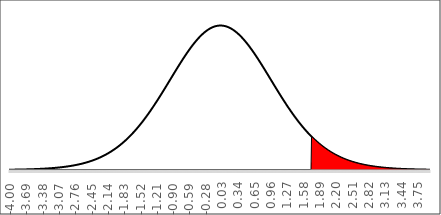
| Category | f(x) | Shaded Area |
|---|---|---|
| -4.0 | 0.001 | 0 |
| -3.99 | 0.001 | 0 |
| -3.9800000000000004 | 0.001 | 0 |
| -3.9700000000000006 | 0.001 | 0 |
| -3.960000000000001 | 0.001 | 0 |
| -3.950000000000001 | 0.001 | 0 |
| -3.9400000000000013 | 0.001 | 0 |
| -3.9300000000000015 | 0.001 | 0 |
| -3.9200000000000017 | 0.001 | 0 |
| -3.910000000000002 | 0.001 | 0 |
| -3.900000000000002 | 0.001 | 0 |
| -3.8900000000000023 | 0.001 | 0 |
| -3.8800000000000026 | 0.001 | 0 |
| -3.8700000000000028 | 0.001 | 0 |
| -3.860000000000003 | 0.001 | 0 |
| -3.850000000000003 | 0.001 | 0 |
| -3.8400000000000034 | 0.001 | 0 |
| -3.8300000000000036 | 0.001 | 0 |
| -3.820000000000004 | 0.001 | 0 |
| -3.810000000000004 | 0.001 | 0 |
| -3.8000000000000043 | 0.001 | 0 |
| -3.7900000000000045 | 0.001 | 0 |
| -3.7800000000000047 | 0.001 | 0 |
| -3.770000000000005 | 0.001 | 0 |
| -3.760000000000005 | 0.001 | 0 |
| -3.7500000000000053 | 0.001 | 0 |
| -3.7400000000000055 | 0.002 | 0 |
| -3.7300000000000058 | 0.002 | 0 |
| -3.720000000000006 | 0.002 | 0 |
| -3.710000000000006 | 0.002 | 0 |
| -3.7000000000000064 | 0.002 | 0 |
| -3.6900000000000066 | 0.002 | 0 |
| -3.680000000000007 | 0.002 | 0 |
| -3.670000000000007 | 0.002 | 0 |
| -3.6600000000000072 | 0.002 | 0 |
| -3.6500000000000075 | 0.002 | 0 |
| -3.6400000000000077 | 0.002 | 0 |
| -3.630000000000008 | 0.002 | 0 |
| -3.620000000000008 | 0.002 | 0 |
| -3.6100000000000083 | 0.002 | 0 |
| -3.6000000000000085 | 0.002 | 0 |
| -3.5900000000000087 | 0.002 | 0 |
| -3.580000000000009 | 0.002 | 0 |
| -3.570000000000009 | 0.002 | 0 |
| -3.5600000000000094 | 0.002 | 0 |
| -3.5500000000000096 | 0.002 | 0 |
| -3.54000000000001 | 0.002 | 0 |
| -3.53000000000001 | 0.002 | 0 |
| -3.5200000000000102 | 0.002 | 0 |
| -3.5100000000000104 | 0.003 | 0 |
| -3.5000000000000107 | 0.003 | 0 |
| -3.490000000000011 | 0.003 | 0 |
| -3.480000000000011 | 0.003 | 0 |
| -3.4700000000000113 | 0.003 | 0 |
| -3.4600000000000115 | 0.003 | 0 |
| -3.4500000000000117 | 0.003 | 0 |
| -3.440000000000012 | 0.003 | 0 |
| -3.430000000000012 | 0.003 | 0 |
| -3.4200000000000124 | 0.003 | 0 |
| -3.4100000000000126 | 0.003 | 0 |
| -3.400000000000013 | 0.003 | 0 |
| -3.390000000000013 | 0.003 | 0 |
| -3.380000000000013 | 0.003 | 0 |
| -3.3700000000000134 | 0.004 | 0 |
| -3.3600000000000136 | 0.004 | 0 |
| -3.350000000000014 | 0.004 | 0 |
| -3.340000000000014 | 0.004 | 0 |
| -3.3300000000000143 | 0.004 | 0 |
| -3.3200000000000145 | 0.004 | 0 |
| -3.3100000000000147 | 0.004 | 0 |
| -3.300000000000015 | 0.004 | 0 |
| -3.290000000000015 | 0.004 | 0 |
| -3.2800000000000153 | 0.004 | 0 |
| -3.2700000000000156 | 0.004 | 0 |
| -3.2600000000000158 | 0.004 | 0 |
| -3.250000000000016 | 0.005 | 0 |
| -3.240000000000016 | 0.005 | 0 |
| -3.2300000000000164 | 0.005 | 0 |
| -3.2200000000000166 | 0.005 | 0 |
| -3.210000000000017 | 0.005 | 0 |
| -3.200000000000017 | 0.005 | 0 |
| -3.1900000000000173 | 0.005 | 0 |
| -3.1800000000000175 | 0.005 | 0 |
| -3.1700000000000177 | 0.005 | 0 |
| -3.160000000000018 | 0.006 | 0 |
| -3.150000000000018 | 0.006 | 0 |
| -3.1400000000000183 | 0.006 | 0 |
| -3.1300000000000185 | 0.006 | 0 |
| -3.1200000000000188 | 0.006 | 0 |
| -3.110000000000019 | 0.006 | 0 |
| -3.100000000000019 | 0.006 | 0 |
| -3.0900000000000194 | 0.007 | 0 |
| -3.0800000000000196 | 0.007 | 0 |
| -3.07000000000002 | 0.007 | 0 |
| -3.06000000000002 | 0.007 | 0 |
| -3.0500000000000203 | 0.007 | 0 |
| -3.0400000000000205 | 0.007 | 0 |
| -3.0300000000000207 | 0.007 | 0 |
| -3.020000000000021 | 0.008 | 0 |
| -3.010000000000021 | 0.008 | 0 |
| -3.0000000000000213 | 0.008 | 0 |
| -2.9900000000000215 | 0.008 | 0 |
| -2.9800000000000217 | 0.008 | 0 |
| -2.970000000000022 | 0.008 | 0 |
| -2.960000000000022 | 0.009 | 0 |
| -2.9500000000000224 | 0.009 | 0 |
| -2.9400000000000226 | 0.009 | 0 |
| -2.930000000000023 | 0.009 | 0 |
| -2.920000000000023 | 0.009 | 0 |
| -2.9100000000000232 | 0.01 | 0 |
| -2.9000000000000234 | 0.01 | 0 |
| -2.8900000000000237 | 0.01 | 0 |
| -2.880000000000024 | 0.01 | 0 |
| -2.870000000000024 | 0.011 | 0 |
| -2.8600000000000243 | 0.011 | 0 |
| -2.8500000000000245 | 0.011 | 0 |
| -2.8400000000000247 | 0.011 | 0 |
| -2.830000000000025 | 0.011 | 0 |
| -2.820000000000025 | 0.012 | 0 |
| -2.8100000000000254 | 0.012 | 0 |
| -2.8000000000000256 | 0.012 | 0 |
| -2.790000000000026 | 0.012 | 0 |
| -2.780000000000026 | 0.013 | 0 |
| -2.770000000000026 | 0.013 | 0 |
| -2.7600000000000264 | 0.013 | 0 |
| -2.7500000000000266 | 0.014 | 0 |
| -2.740000000000027 | 0.014 | 0 |
| -2.730000000000027 | 0.014 | 0 |
| -2.7200000000000273 | 0.014 | 0 |
| -2.7100000000000275 | 0.015 | 0 |
| -2.7000000000000277 | 0.015 | 0 |
| -2.690000000000028 | 0.015 | 0 |
| -2.680000000000028 | 0.016 | 0 |
| -2.6700000000000284 | 0.016 | 0 |
| -2.6600000000000286 | 0.016 | 0 |
| -2.6500000000000288 | 0.017 | 0 |
| -2.640000000000029 | 0.017 | 0 |
| -2.630000000000029 | 0.017 | 0 |
| -2.6200000000000294 | 0.018 | 0 |
| -2.6100000000000296 | 0.018 | 0 |
| -2.60000000000003 | 0.019 | 0 |
| -2.59000000000003 | 0.019 | 0 |
| -2.5800000000000303 | 0.019 | 0 |
| -2.5700000000000305 | 0.02 | 0 |
| -2.5600000000000307 | 0.02 | 0 |
| -2.550000000000031 | 0.021 | 0 |
| -2.540000000000031 | 0.021 | 0 |
| -2.5300000000000313 | 0.021 | 0 |
| -2.5200000000000315 | 0.022 | 0 |
| -2.5100000000000318 | 0.022 | 0 |
| -2.500000000000032 | 0.023 | 0 |
| -2.490000000000032 | 0.023 | 0 |
| -2.4800000000000324 | 0.024 | 0 |
| -2.4700000000000326 | 0.024 | 0 |
| -2.460000000000033 | 0.025 | 0 |
| -2.450000000000033 | 0.025 | 0 |
| -2.4400000000000333 | 0.026 | 0 |
| -2.4300000000000335 | 0.026 | 0 |
| -2.4200000000000337 | 0.027 | 0 |
| -2.410000000000034 | 0.027 | 0 |
| -2.400000000000034 | 0.028 | 0 |
| -2.3900000000000343 | 0.028 | 0 |
| -2.3800000000000345 | 0.029 | 0 |
| -2.3700000000000347 | 0.029 | 0 |
| -2.360000000000035 | 0.03 | 0 |
| -2.350000000000035 | 0.03 | 0 |
| -2.3400000000000354 | 0.031 | 0 |
| -2.3300000000000356 | 0.032 | 0 |
| -2.320000000000036 | 0.032 | 0 |
| -2.310000000000036 | 0.033 | 0 |
| -2.3000000000000362 | 0.034 | 0 |
| -2.2900000000000365 | 0.034 | 0 |
| -2.2800000000000367 | 0.035 | 0 |
| -2.270000000000037 | 0.035 | 0 |
| -2.260000000000037 | 0.036 | 0 |
| -2.2500000000000373 | 0.037 | 0 |
| -2.2400000000000375 | 0.038 | 0 |
| -2.2300000000000377 | 0.038 | 0 |
| -2.220000000000038 | 0.039 | 0 |
| -2.210000000000038 | 0.04 | 0 |
| -2.2000000000000384 | 0.04 | 0 |
| -2.1900000000000386 | 0.041 | 0 |
| -2.180000000000039 | 0.042 | 0 |
| -2.170000000000039 | 0.043 | 0 |
| -2.160000000000039 | 0.044 | 0 |
| -2.1500000000000394 | 0.044 | 0 |
| -2.1400000000000396 | 0.045 | 0 |
| -2.13000000000004 | 0.046 | 0 |
| -2.12000000000004 | 0.047 | 0 |
| -2.1100000000000403 | 0.048 | 0 |
| -2.1000000000000405 | 0.049 | 0 |
| -2.0900000000000407 | 0.05 | 0 |
| -2.080000000000041 | 0.05 | 0 |
| -2.070000000000041 | 0.051 | 0 |
| -2.0600000000000414 | 0.052 | 0 |
| -2.0500000000000416 | 0.053 | 0 |
| -2.040000000000042 | 0.054 | 0 |
| -2.030000000000042 | 0.055 | 0 |
| -2.020000000000042 | 0.056 | 0 |
| -2.0100000000000424 | 0.057 | 0 |
| -2.0000000000000426 | 0.058 | 0 |
| -1.9900000000000426 | 0.059 | 0 |
| -1.9800000000000426 | 0.06 | 0 |
| -1.9700000000000426 | 0.061 | 0 |
| -1.9600000000000426 | 0.062 | 0 |
| -1.9500000000000426 | 0.063 | 0 |
| -1.9400000000000426 | 0.064 | 0 |
| -1.9300000000000426 | 0.066 | 0 |
| -1.9200000000000426 | 0.067 | 0 |
| -1.9100000000000426 | 0.068 | 0 |
| -1.9000000000000425 | 0.069 | 0 |
| -1.8900000000000425 | 0.07 | 0 |
| -1.8800000000000425 | 0.071 | 0 |
| -1.8700000000000425 | 0.073 | 0 |
| -1.8600000000000425 | 0.074 | 0 |
| -1.8500000000000425 | 0.075 | 0 |
| -1.8400000000000425 | 0.076 | 0 |
| -1.8300000000000425 | 0.078 | 0 |
| -1.8200000000000425 | 0.079 | 0 |
| -1.8100000000000425 | 0.08 | 0 |
| -1.8000000000000425 | 0.081 | 0 |
| -1.7900000000000424 | 0.083 | 0 |
| -1.7800000000000424 | 0.084 | 0 |
| -1.7700000000000424 | 0.085 | 0 |
| -1.7600000000000424 | 0.087 | 0 |
| -1.7500000000000424 | 0.088 | 0 |
| -1.7400000000000424 | 0.09 | 0 |
| -1.7300000000000424 | 0.091 | 0 |
| -1.7200000000000424 | 0.093 | 0 |
| -1.7100000000000424 | 0.094 | 0 |
| -1.7000000000000424 | 0.096 | 0 |
| -1.6900000000000424 | 0.097 | 0 |
| -1.6800000000000423 | 0.099 | 0 |
| -1.6700000000000423 | 0.1 | 0 |
| -1.6600000000000423 | 0.102 | 0 |
| -1.6500000000000423 | 0.103 | 0 |
| -1.6400000000000423 | 0.105 | 0 |
| -1.6300000000000423 | 0.106 | 0 |
| -1.6200000000000423 | 0.108 | 0 |
| -1.6100000000000423 | 0.11 | 0 |
| -1.6000000000000423 | 0.111 | 0 |
| -1.5900000000000423 | 0.113 | 0 |
| -1.5800000000000423 | 0.115 | 0 |
| -1.5700000000000423 | 0.116 | 0 |
| -1.5600000000000422 | 0.118 | 0 |
| -1.5500000000000422 | 0.12 | 0 |
| -1.5400000000000422 | 0.121 | 0 |
| -1.5300000000000422 | 0.123 | 0 |
| -1.5200000000000422 | 0.125 | 0 |
| -1.5100000000000422 | 0.127 | 0 |
| -1.5000000000000422 | 0.129 | 0 |
| -1.4900000000000422 | 0.13 | 0 |
| -1.4800000000000422 | 0.132 | 0 |
| -1.4700000000000422 | 0.134 | 0 |
| -1.4600000000000422 | 0.136 | 0 |
| -1.4500000000000421 | 0.138 | 0 |
| -1.4400000000000421 | 0.14 | 0 |
| -1.4300000000000421 | 0.142 | 0 |
| -1.4200000000000421 | 0.144 | 0 |
| -1.410000000000042 | 0.146 | 0 |
| -1.400000000000042 | 0.148 | 0 |
| -1.390000000000042 | 0.15 | 0 |
| -1.380000000000042 | 0.152 | 0 |
| -1.370000000000042 | 0.154 | 0 |
| -1.360000000000042 | 0.156 | 0 |
| -1.350000000000042 | 0.158 | 0 |
| -1.340000000000042 | 0.16 | 0 |
| -1.330000000000042 | 0.162 | 0 |
| -1.320000000000042 | 0.164 | 0 |
| -1.310000000000042 | 0.166 | 0 |
| -1.300000000000042 | 0.168 | 0 |
| -1.290000000000042 | 0.17 | 0 |
| -1.280000000000042 | 0.172 | 0 |
| -1.270000000000042 | 0.175 | 0 |
| -1.260000000000042 | 0.177 | 0 |
| -1.250000000000042 | 0.179 | 0 |
| -1.240000000000042 | 0.181 | 0 |
| -1.230000000000042 | 0.183 | 0 |
| -1.220000000000042 | 0.185 | 0 |
| -1.210000000000042 | 0.188 | 0 |
| -1.200000000000042 | 0.19 | 0 |
| -1.190000000000042 | 0.192 | 0 |
| -1.180000000000042 | 0.194 | 0 |
| -1.170000000000042 | 0.197 | 0 |
| -1.1600000000000419 | 0.199 | 0 |
| -1.1500000000000419 | 0.201 | 0 |
| -1.1400000000000419 | 0.203 | 0 |
| -1.1300000000000419 | 0.206 | 0 |
| -1.1200000000000419 | 0.208 | 0 |
| -1.1100000000000418 | 0.21 | 0 |
| -1.1000000000000418 | 0.213 | 0 |
| -1.0900000000000418 | 0.215 | 0 |
| -1.0800000000000418 | 0.217 | 0 |
| -1.0700000000000418 | 0.22 | 0 |
| -1.0600000000000418 | 0.222 | 0 |
| -1.0500000000000418 | 0.224 | 0 |
| -1.0400000000000418 | 0.227 | 0 |
| -1.0300000000000418 | 0.229 | 0 |
| -1.0200000000000418 | 0.231 | 0 |
| -1.0100000000000418 | 0.234 | 0 |
| -1.0000000000000417 | 0.236 | 0 |
| -0.9900000000000417 | 0.238 | 0 |
| -0.9800000000000417 | 0.241 | 0 |
| -0.9700000000000417 | 0.243 | 0 |
| -0.9600000000000417 | 0.246 | 0 |
| -0.9500000000000417 | 0.248 | 0 |
| -0.9400000000000417 | 0.25 | 0 |
| -0.9300000000000417 | 0.253 | 0 |
| -0.9200000000000417 | 0.255 | 0 |
| -0.9100000000000417 | 0.257 | 0 |
| -0.9000000000000417 | 0.26 | 0 |
| -0.8900000000000416 | 0.262 | 0 |
| -0.8800000000000416 | 0.264 | 0 |
| -0.8700000000000416 | 0.267 | 0 |
| -0.8600000000000416 | 0.269 | 0 |
| -0.8500000000000416 | 0.271 | 0 |
| -0.8400000000000416 | 0.274 | 0 |
| -0.8300000000000416 | 0.276 | 0 |
| -0.8200000000000416 | 0.278 | 0 |
| -0.8100000000000416 | 0.281 | 0 |
| -0.8000000000000416 | 0.283 | 0 |
| -0.7900000000000416 | 0.285 | 0 |
| -0.7800000000000415 | 0.288 | 0 |
| -0.7700000000000415 | 0.29 | 0 |
| -0.7600000000000415 | 0.292 | 0 |
| -0.7500000000000415 | 0.294 | 0 |
| -0.7400000000000415 | 0.297 | 0 |
| -0.7300000000000415 | 0.299 | 0 |
| -0.7200000000000415 | 0.301 | 0 |
| -0.7100000000000415 | 0.303 | 0 |
| -0.7000000000000415 | 0.306 | 0 |
| -0.6900000000000415 | 0.308 | 0 |
| -0.6800000000000415 | 0.31 | 0 |
| -0.6700000000000415 | 0.312 | 0 |
| -0.6600000000000414 | 0.314 | 0 |
| -0.6500000000000414 | 0.316 | 0 |
| -0.6400000000000414 | 0.318 | 0 |
| -0.6300000000000414 | 0.321 | 0 |
| -0.6200000000000414 | 0.323 | 0 |
| -0.6100000000000414 | 0.325 | 0 |
| -0.6000000000000414 | 0.327 | 0 |
| -0.5900000000000414 | 0.329 | 0 |
| -0.5800000000000414 | 0.331 | 0 |
| -0.5700000000000414 | 0.333 | 0 |
| -0.5600000000000414 | 0.335 | 0 |
| -0.5500000000000413 | 0.337 | 0 |
| -0.5400000000000413 | 0.338 | 0 |
| -0.5300000000000413 | 0.34 | 0 |
| -0.5200000000000413 | 0.342 | 0 |
| -0.5100000000000413 | 0.344 | 0 |
| -0.5000000000000413 | 0.346 | 0 |
| -0.4900000000000413 | 0.348 | 0 |
| -0.4800000000000413 | 0.349 | 0 |
| -0.4700000000000413 | 0.351 | 0 |
| -0.46000000000004126 | 0.353 | 0 |
| -0.45000000000004126 | 0.354 | 0 |
| -0.44000000000004125 | 0.356 | 0 |
| -0.43000000000004124 | 0.358 | 0 |
| -0.42000000000004123 | 0.359 | 0 |
| -0.4100000000000412 | 0.361 | 0 |
| -0.4000000000000412 | 0.362 | 0 |
| -0.3900000000000412 | 0.364 | 0 |
| -0.3800000000000412 | 0.365 | 0 |
| -0.3700000000000412 | 0.367 | 0 |
| -0.3600000000000412 | 0.368 | 0 |
| -0.35000000000004117 | 0.37 | 0 |
| -0.34000000000004116 | 0.371 | 0 |
| -0.33000000000004115 | 0.372 | 0 |
| -0.32000000000004114 | 0.373 | 0 |
| -0.31000000000004113 | 0.375 | 0 |
| -0.3000000000000411 | 0.376 | 0 |
| -0.2900000000000411 | 0.377 | 0 |
| -0.2800000000000411 | 0.378 | 0 |
| -0.2700000000000411 | 0.379 | 0 |
| -0.2600000000000411 | 0.38 | 0 |
| -0.2500000000000411 | 0.381 | 0 |
| -0.24000000000004107 | 0.382 | 0 |
| -0.23000000000004106 | 0.383 | 0 |
| -0.22000000000004105 | 0.384 | 0 |
| -0.21000000000004104 | 0.385 | 0 |
| -0.20000000000004103 | 0.386 | 0 |
| -0.19000000000004102 | 0.387 | 0 |
| -0.18000000000004102 | 0.387 | 0 |
| -0.170000000000041 | 0.388 | 0 |
| -0.160000000000041 | 0.389 | 0 |
| -0.150000000000041 | 0.389 | 0 |
| -0.14000000000004098 | 0.39 | 0 |
| -0.13000000000004097 | 0.391 | 0 |
| -0.12000000000004098 | 0.391 | 0 |
| -0.11000000000004098 | 0.391 | 0 |
| -0.10000000000004099 | 0.392 | 0 |
| -0.09000000000004099 | 0.392 | 0 |
| -0.080000000000041 | 0.393 | 0 |
| -0.070000000000041 | 0.393 | 0 |
| -0.060000000000041 | 0.393 | 0 |
| -0.050000000000041 | 0.393 | 0 |
| -0.040000000000040996 | 0.394 | 0 |
| -0.030000000000040994 | 0.394 | 0 |
| -0.020000000000040992 | 0.394 | 0 |
| -0.010000000000040992 | 0.394 | 0 |
| -4.099151573733195e-14 | 0.394 | 0 |
| 0.009999999999959009 | 0.394 | 0 |
| 0.01999999999995901 | 0.394 | 0 |
| 0.02999999999995901 | 0.394 | 0 |
| 0.03999999999995901 | 0.394 | 0 |
| 0.049999999999959015 | 0.393 | 0 |
| 0.05999999999995902 | 0.393 | 0 |
| 0.06999999999995901 | 0.393 | 0 |
| 0.079999999999959 | 0.393 | 0 |
| 0.089999999999959 | 0.392 | 0 |
| 0.099999999999959 | 0.392 | 0 |
| 0.10999999999995899 | 0.391 | 0 |
| 0.11999999999995899 | 0.391 | 0 |
| 0.12999999999995898 | 0.391 | 0 |
| 0.139999999999959 | 0.39 | 0 |
| 0.149999999999959 | 0.389 | 0 |
| 0.159999999999959 | 0.389 | 0 |
| 0.16999999999995902 | 0.388 | 0 |
| 0.17999999999995903 | 0.387 | 0 |
| 0.18999999999995903 | 0.387 | 0 |
| 0.19999999999995904 | 0.386 | 0 |
| 0.20999999999995905 | 0.385 | 0 |
| 0.21999999999995906 | 0.384 | 0 |
| 0.22999999999995907 | 0.383 | 0 |
| 0.23999999999995908 | 0.382 | 0 |
| 0.2499999999999591 | 0.381 | 0 |
| 0.2599999999999591 | 0.38 | 0 |
| 0.2699999999999591 | 0.379 | 0 |
| 0.2799999999999591 | 0.378 | 0 |
| 0.2899999999999591 | 0.377 | 0 |
| 0.29999999999995913 | 0.376 | 0 |
| 0.30999999999995914 | 0.375 | 0 |
| 0.31999999999995915 | 0.373 | 0 |
| 0.32999999999995916 | 0.372 | 0 |
| 0.33999999999995917 | 0.371 | 0 |
| 0.3499999999999592 | 0.37 | 0 |
| 0.3599999999999592 | 0.368 | 0 |
| 0.3699999999999592 | 0.367 | 0 |
| 0.3799999999999592 | 0.365 | 0 |
| 0.3899999999999592 | 0.364 | 0 |
| 0.3999999999999592 | 0.362 | 0 |
| 0.40999999999995923 | 0.361 | 0 |
| 0.41999999999995924 | 0.359 | 0 |
| 0.42999999999995925 | 0.358 | 0 |
| 0.43999999999995926 | 0.356 | 0 |
| 0.44999999999995927 | 0.354 | 0 |
| 0.4599999999999593 | 0.353 | 0 |
| 0.4699999999999593 | 0.351 | 0 |
| 0.4799999999999593 | 0.349 | 0 |
| 0.4899999999999593 | 0.348 | 0 |
| 0.4999999999999593 | 0.346 | 0 |
| 0.5099999999999593 | 0.344 | 0 |
| 0.5199999999999593 | 0.342 | 0 |
| 0.5299999999999593 | 0.34 | 0 |
| 0.5399999999999593 | 0.338 | 0 |
| 0.5499999999999593 | 0.337 | 0 |
| 0.5599999999999593 | 0.335 | 0 |
| 0.5699999999999593 | 0.333 | 0 |
| 0.5799999999999593 | 0.331 | 0 |
| 0.5899999999999593 | 0.329 | 0 |
| 0.5999999999999593 | 0.327 | 0 |
| 0.6099999999999594 | 0.325 | 0 |
| 0.6199999999999594 | 0.323 | 0 |
| 0.6299999999999594 | 0.321 | 0 |
| 0.6399999999999594 | 0.318 | 0 |
| 0.6499999999999594 | 0.316 | 0 |
| 0.6599999999999594 | 0.314 | 0 |
| 0.6699999999999594 | 0.312 | 0 |
| 0.6799999999999594 | 0.31 | 0 |
| 0.6899999999999594 | 0.308 | 0 |
| 0.6999999999999594 | 0.306 | 0 |
| 0.7099999999999594 | 0.303 | 0 |
| 0.7199999999999595 | 0.301 | 0 |
| 0.7299999999999595 | 0.299 | 0 |
| 0.7399999999999595 | 0.297 | 0 |
| 0.7499999999999595 | 0.294 | 0 |
| 0.7599999999999595 | 0.292 | 0 |
| 0.7699999999999595 | 0.29 | 0 |
| 0.7799999999999595 | 0.288 | 0 |
| 0.7899999999999595 | 0.285 | 0 |
| 0.7999999999999595 | 0.283 | 0 |
| 0.8099999999999595 | 0.281 | 0 |
| 0.8199999999999595 | 0.278 | 0 |
| 0.8299999999999595 | 0.276 | 0 |
| 0.8399999999999596 | 0.274 | 0 |
| 0.8499999999999596 | 0.271 | 0 |
| 0.8599999999999596 | 0.269 | 0 |
| 0.8699999999999596 | 0.267 | 0 |
| 0.8799999999999596 | 0.264 | 0 |
| 0.8899999999999596 | 0.262 | 0 |
| 0.8999999999999596 | 0.26 | 0 |
| 0.9099999999999596 | 0.257 | 0 |
| 0.9199999999999596 | 0.255 | 0 |
| 0.9299999999999596 | 0.253 | 0 |
| 0.9399999999999596 | 0.25 | 0 |
| 0.9499999999999597 | 0.248 | 0 |
| 0.9599999999999597 | 0.246 | 0 |
| 0.9699999999999597 | 0.243 | 0 |
| 0.9799999999999597 | 0.241 | 0 |
| 0.9899999999999597 | 0.238 | 0 |
| 0.9999999999999597 | 0.236 | 0 |
| 1.0099999999999596 | 0.234 | 0 |
| 1.0199999999999596 | 0.231 | 0 |
| 1.0299999999999596 | 0.229 | 0 |
| 1.0399999999999596 | 0.227 | 0 |
| 1.0499999999999596 | 0.224 | 0 |
| 1.0599999999999596 | 0.222 | 0 |
| 1.0699999999999597 | 0.22 | 0 |
| 1.0799999999999597 | 0.217 | 0 |
| 1.0899999999999597 | 0.215 | 0 |
| 1.0999999999999597 | 0.213 | 0 |
| 1.1099999999999597 | 0.21 | 0 |
| 1.1199999999999597 | 0.208 | 0 |
| 1.1299999999999597 | 0.206 | 0 |
| 1.1399999999999597 | 0.203 | 0 |
| 1.1499999999999597 | 0.201 | 0 |
| 1.1599999999999597 | 0.199 | 0 |
| 1.1699999999999597 | 0.197 | 0 |
| 1.1799999999999597 | 0.194 | 0 |
| 1.1899999999999598 | 0.192 | 0 |
| 1.1999999999999598 | 0.19 | 0 |
| 1.2099999999999598 | 0.188 | 0 |
| 1.2199999999999598 | 0.185 | 0 |
| 1.2299999999999598 | 0.183 | 0 |
| 1.2399999999999598 | 0.181 | 0 |
| 1.2499999999999598 | 0.179 | 0 |
| 1.2599999999999598 | 0.177 | 0 |
| 1.2699999999999598 | 0.175 | 0 |
| 1.2799999999999598 | 0.172 | 0 |
| 1.2899999999999598 | 0.17 | 0 |
| 1.2999999999999599 | 0.168 | 0 |
| 1.3099999999999599 | 0.166 | 0 |
| 1.3199999999999599 | 0.164 | 0 |
| 1.3299999999999599 | 0.162 | 0 |
| 1.33999999999996 | 0.16 | 0 |
| 1.34999999999996 | 0.158 | 0 |
| 1.35999999999996 | 0.156 | 0 |
| 1.36999999999996 | 0.154 | 0 |
| 1.37999999999996 | 0.152 | 0 |
| 1.38999999999996 | 0.15 | 0 |
| 1.39999999999996 | 0.148 | 0 |
| 1.40999999999996 | 0.146 | 0 |
| 1.41999999999996 | 0.144 | 0 |
| 1.42999999999996 | 0.142 | 0 |
| 1.43999999999996 | 0.14 | 0 |
| 1.44999999999996 | 0.138 | 0 |
| 1.45999999999996 | 0.136 | 0 |
| 1.46999999999996 | 0.134 | 0 |
| 1.47999999999996 | 0.132 | 0 |
| 1.48999999999996 | 0.13 | 0 |
| 1.49999999999996 | 0.129 | 0 |
| 1.50999999999996 | 0.127 | 0 |
| 1.51999999999996 | 0.125 | 0 |
| 1.52999999999996 | 0.123 | 0 |
| 1.53999999999996 | 0.121 | 0 |
| 1.54999999999996 | 0.12 | 0 |
| 1.55999999999996 | 0.118 | 0 |
| 1.56999999999996 | 0.116 | 0 |
| 1.57999999999996 | 0.115 | 0 |
| 1.5899999999999601 | 0.113 | 0 |
| 1.5999999999999601 | 0.111 | 0 |
| 1.6099999999999601 | 0.11 | 0 |
| 1.6199999999999601 | 0.108 | 0 |
| 1.6299999999999601 | 0.106 | 0 |
| 1.6399999999999602 | 0.105 | 0 |
| 1.6499999999999602 | 0.103 | 0 |
| 1.6599999999999602 | 0.102 | 0 |
| 1.6699999999999602 | 0.1 | 0 |
| 1.6799999999999602 | 0.099 | 0 |
| 1.6899999999999602 | 0.097 | 0 |
| 1.6999999999999602 | 0.096 | 0 |
| 1.7099999999999602 | 0.094 | 0 |
| 1.7199999999999602 | 0.093 | 0 |
| 1.7299999999999602 | 0.091 | 0.091 |
| 1.7399999999999602 | 0.09 | 0.09 |
| 1.7499999999999603 | 0.088 | 0.088 |
| 1.7599999999999603 | 0.087 | 0.087 |
| 1.7699999999999603 | 0.085 | 0.085 |
| 1.7799999999999603 | 0.084 | 0.084 |
| 1.7899999999999603 | 0.083 | 0.083 |
| 1.7999999999999603 | 0.081 | 0.081 |
| 1.8099999999999603 | 0.08 | 0.08 |
| 1.8199999999999603 | 0.079 | 0.079 |
| 1.8299999999999603 | 0.078 | 0.078 |
| 1.8399999999999603 | 0.076 | 0.076 |
| 1.8499999999999603 | 0.075 | 0.075 |
| 1.8599999999999604 | 0.074 | 0.074 |
| 1.8699999999999604 | 0.073 | 0.073 |
| 1.8799999999999604 | 0.071 | 0.071 |
| 1.8899999999999604 | 0.07 | 0.07 |
| 1.8999999999999604 | 0.069 | 0.069 |
| 1.9099999999999604 | 0.068 | 0.068 |
| 1.9199999999999604 | 0.067 | 0.067 |
| 1.9299999999999604 | 0.066 | 0.066 |
| 1.9399999999999604 | 0.064 | 0.064 |
| 1.9499999999999604 | 0.063 | 0.063 |
| 1.9599999999999604 | 0.062 | 0.062 |
| 1.9699999999999604 | 0.061 | 0.061 |
| 1.9799999999999605 | 0.06 | 0.06 |
| 1.9899999999999605 | 0.059 | 0.059 |
| 1.9999999999999605 | 0.058 | 0.058 |
| 2.0099999999999603 | 0.057 | 0.057 |
| 2.01999999999996 | 0.056 | 0.056 |
| 2.02999999999996 | 0.055 | 0.055 |
| 2.0399999999999596 | 0.054 | 0.054 |
| 2.0499999999999594 | 0.053 | 0.053 |
| 2.059999999999959 | 0.052 | 0.052 |
| 2.069999999999959 | 0.051 | 0.051 |
| 2.0799999999999588 | 0.05 | 0.05 |
| 2.0899999999999586 | 0.05 | 0.05 |
| 2.0999999999999583 | 0.049 | 0.049 |
| 2.109999999999958 | 0.048 | 0.048 |
| 2.119999999999958 | 0.047 | 0.047 |
| 2.1299999999999577 | 0.046 | 0.046 |
| 2.1399999999999575 | 0.045 | 0.045 |
| 2.1499999999999573 | 0.044 | 0.044 |
| 2.159999999999957 | 0.044 | 0.044 |
| 2.169999999999957 | 0.043 | 0.043 |
| 2.1799999999999566 | 0.042 | 0.042 |
| 2.1899999999999564 | 0.041 | 0.041 |
| 2.199999999999956 | 0.04 | 0.04 |
| 2.209999999999956 | 0.04 | 0.04 |
| 2.219999999999956 | 0.039 | 0.039 |
| 2.2299999999999556 | 0.038 | 0.038 |
| 2.2399999999999554 | 0.038 | 0.038 |
| 2.249999999999955 | 0.037 | 0.037 |
| 2.259999999999955 | 0.036 | 0.036 |
| 2.2699999999999547 | 0.035 | 0.035 |
| 2.2799999999999545 | 0.035 | 0.035 |
| 2.2899999999999543 | 0.034 | 0.034 |
| 2.299999999999954 | 0.034 | 0.034 |
| 2.309999999999954 | 0.033 | 0.033 |
| 2.3199999999999537 | 0.032 | 0.032 |
| 2.3299999999999534 | 0.032 | 0.032 |
| 2.3399999999999532 | 0.031 | 0.031 |
| 2.349999999999953 | 0.03 | 0.03 |
| 2.359999999999953 | 0.03 | 0.03 |
| 2.3699999999999526 | 0.029 | 0.029 |
| 2.3799999999999524 | 0.029 | 0.029 |
| 2.389999999999952 | 0.028 | 0.028 |
| 2.399999999999952 | 0.028 | 0.028 |
| 2.4099999999999517 | 0.027 | 0.027 |
| 2.4199999999999515 | 0.027 | 0.027 |
| 2.4299999999999513 | 0.026 | 0.026 |
| 2.439999999999951 | 0.026 | 0.026 |
| 2.449999999999951 | 0.025 | 0.025 |
| 2.4599999999999507 | 0.025 | 0.025 |
| 2.4699999999999505 | 0.024 | 0.024 |
| 2.4799999999999502 | 0.024 | 0.024 |
| 2.48999999999995 | 0.023 | 0.023 |
| 2.49999999999995 | 0.023 | 0.023 |
| 2.5099999999999496 | 0.022 | 0.022 |
| 2.5199999999999494 | 0.022 | 0.022 |
| 2.529999999999949 | 0.021 | 0.021 |
| 2.539999999999949 | 0.021 | 0.021 |
| 2.5499999999999488 | 0.021 | 0.021 |
| 2.5599999999999485 | 0.02 | 0.02 |
| 2.5699999999999483 | 0.02 | 0.02 |
| 2.579999999999948 | 0.019 | 0.019 |
| 2.589999999999948 | 0.019 | 0.019 |
| 2.5999999999999477 | 0.019 | 0.019 |
| 2.6099999999999475 | 0.018 | 0.018 |
| 2.6199999999999473 | 0.018 | 0.018 |
| 2.629999999999947 | 0.017 | 0.017 |
| 2.639999999999947 | 0.017 | 0.017 |
| 2.6499999999999466 | 0.017 | 0.017 |
| 2.6599999999999464 | 0.016 | 0.016 |
| 2.669999999999946 | 0.016 | 0.016 |
| 2.679999999999946 | 0.016 | 0.016 |
| 2.6899999999999458 | 0.015 | 0.015 |
| 2.6999999999999456 | 0.015 | 0.015 |
| 2.7099999999999453 | 0.015 | 0.015 |
| 2.719999999999945 | 0.014 | 0.014 |
| 2.729999999999945 | 0.014 | 0.014 |
| 2.7399999999999447 | 0.014 | 0.014 |
| 2.7499999999999445 | 0.014 | 0.014 |
| 2.7599999999999443 | 0.013 | 0.013 |
| 2.769999999999944 | 0.013 | 0.013 |
| 2.779999999999944 | 0.013 | 0.013 |
| 2.7899999999999436 | 0.012 | 0.012 |
| 2.7999999999999434 | 0.012 | 0.012 |
| 2.809999999999943 | 0.012 | 0.012 |
| 2.819999999999943 | 0.012 | 0.012 |
| 2.829999999999943 | 0.011 | 0.011 |
| 2.8399999999999426 | 0.011 | 0.011 |
| 2.8499999999999424 | 0.011 | 0.011 |
| 2.859999999999942 | 0.011 | 0.011 |
| 2.869999999999942 | 0.011 | 0.011 |
| 2.8799999999999417 | 0.01 | 0.01 |
| 2.8899999999999415 | 0.01 | 0.01 |
| 2.8999999999999413 | 0.01 | 0.01 |
| 2.909999999999941 | 0.01 | 0.01 |
| 2.919999999999941 | 0.009 | 0.009 |
| 2.9299999999999407 | 0.009 | 0.009 |
| 2.9399999999999404 | 0.009 | 0.009 |
| 2.9499999999999402 | 0.009 | 0.009 |
| 2.95999999999994 | 0.009 | 0.009 |
| 2.96999999999994 | 0.008 | 0.008 |
| 2.9799999999999396 | 0.008 | 0.008 |
| 2.9899999999999394 | 0.008 | 0.008 |
| 2.999999999999939 | 0.008 | 0.008 |
| 3.009999999999939 | 0.008 | 0.008 |
| 3.0199999999999387 | 0.008 | 0.008 |
| 3.0299999999999385 | 0.007 | 0.007 |
| 3.0399999999999383 | 0.007 | 0.007 |
| 3.049999999999938 | 0.007 | 0.007 |
| 3.059999999999938 | 0.007 | 0.007 |
| 3.0699999999999377 | 0.007 | 0.007 |
| 3.0799999999999375 | 0.007 | 0.007 |
| 3.0899999999999372 | 0.007 | 0.007 |
| 3.099999999999937 | 0.006 | 0.006 |
| 3.109999999999937 | 0.006 | 0.006 |
| 3.1199999999999366 | 0.006 | 0.006 |
| 3.1299999999999364 | 0.006 | 0.006 |
| 3.139999999999936 | 0.006 | 0.006 |
| 3.149999999999936 | 0.006 | 0.006 |
| 3.1599999999999357 | 0.006 | 0.006 |
| 3.1699999999999355 | 0.005 | 0.005 |
| 3.1799999999999353 | 0.005 | 0.005 |
| 3.189999999999935 | 0.005 | 0.005 |
| 3.199999999999935 | 0.005 | 0.005 |
| 3.2099999999999347 | 0.005 | 0.005 |
| 3.2199999999999345 | 0.005 | 0.005 |
| 3.2299999999999343 | 0.005 | 0.005 |
| 3.239999999999934 | 0.005 | 0.005 |
| 3.249999999999934 | 0.005 | 0.005 |
| 3.2599999999999336 | 0.004 | 0.004 |
| 3.2699999999999334 | 0.004 | 0.004 |
| 3.279999999999933 | 0.004 | 0.004 |
| 3.289999999999933 | 0.004 | 0.004 |
| 3.2999999999999328 | 0.004 | 0.004 |
| 3.3099999999999326 | 0.004 | 0.004 |
| 3.3199999999999323 | 0.004 | 0.004 |
| 3.329999999999932 | 0.004 | 0.004 |
| 3.339999999999932 | 0.004 | 0.004 |
| 3.3499999999999317 | 0.004 | 0.004 |
| 3.3599999999999315 | 0.004 | 0.004 |
| 3.3699999999999313 | 0.004 | 0.004 |
| 3.379999999999931 | 0.003 | 0.003 |
| 3.389999999999931 | 0.003 | 0.003 |
| 3.3999999999999306 | 0.003 | 0.003 |
| 3.4099999999999304 | 0.003 | 0.003 |
| 3.41999999999993 | 0.003 | 0.003 |
| 3.42999999999993 | 0.003 | 0.003 |
| 3.43999999999993 | 0.003 | 0.003 |
| 3.4499999999999296 | 0.003 | 0.003 |
| 3.4599999999999294 | 0.003 | 0.003 |
| 3.469999999999929 | 0.003 | 0.003 |
| 3.479999999999929 | 0.003 | 0.003 |
| 3.4899999999999287 | 0.003 | 0.003 |
| 3.4999999999999285 | 0.003 | 0.003 |
| 3.5099999999999283 | 0.003 | 0.003 |
| 3.519999999999928 | 0.002 | 0.002 |
| 3.529999999999928 | 0.002 | 0.002 |
| 3.5399999999999276 | 0.002 | 0.002 |
| 3.5499999999999274 | 0.002 | 0.002 |
| 3.5599999999999272 | 0.002 | 0.002 |
| 3.569999999999927 | 0.002 | 0.002 |
| 3.579999999999927 | 0.002 | 0.002 |
| 3.5899999999999266 | 0.002 | 0.002 |
| 3.5999999999999264 | 0.002 | 0.002 |
| 3.609999999999926 | 0.002 | 0.002 |
| 3.619999999999926 | 0.002 | 0.002 |
| 3.6299999999999257 | 0.002 | 0.002 |
| 3.6399999999999255 | 0.002 | 0.002 |
| 3.6499999999999253 | 0.002 | 0.002 |
| 3.659999999999925 | 0.002 | 0.002 |
| 3.669999999999925 | 0.002 | 0.002 |
| 3.6799999999999247 | 0.002 | 0.002 |
| 3.6899999999999245 | 0.002 | 0.002 |
| 3.6999999999999242 | 0.002 | 0.002 |
| 3.709999999999924 | 0.002 | 0.002 |
| 3.719999999999924 | 0.002 | 0.002 |
| 3.7299999999999236 | 0.002 | 0.002 |
| 3.7399999999999234 | 0.002 | 0.002 |
| 3.749999999999923 | 0.001 | 0.001 |
| 3.759999999999923 | 0.001 | 0.001 |
| 3.7699999999999227 | 0.001 | 0.001 |
| 3.7799999999999225 | 0.001 | 0.001 |
| 3.7899999999999223 | 0.001 | 0.001 |
| 3.799999999999922 | 0.001 | 0.001 |
| 3.809999999999922 | 0.001 | 0.001 |
| 3.8199999999999217 | 0.001 | 0.001 |
| 3.8299999999999215 | 0.001 | 0.001 |
| 3.8399999999999213 | 0.001 | 0.001 |
| 3.849999999999921 | 0.001 | 0.001 |
| 3.859999999999921 | 0.001 | 0.001 |
| 3.8699999999999206 | 0.001 | 0.001 |
| 3.8799999999999204 | 0.001 | 0.001 |
| 3.88999999999992 | 0.001 | 0.001 |
| 3.89999999999992 | 0.001 | 0.001 |
| 3.9099999999999198 | 0.001 | 0.001 |
| 3.9199999999999195 | 0.001 | 0.001 |
| 3.9299999999999193 | 0.001 | 0.001 |
| 3.939999999999919 | 0.001 | 0.001 |
| 3.949999999999919 | 0.001 | 0.001 |
| 3.9599999999999187 | 0.001 | 0.001 |
| 3.9699999999999185 | 0.001 | 0.001 |
| 3.9799999999999183 | 0.001 | 0.001 |
| 3.989999999999918 | 0.001 | 0.001 |
| 3.999999999999918 | 0.001 | 0.001 |